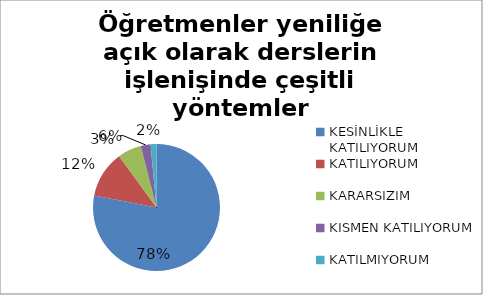
| Category | Öğretmenler yeniliğe açık olarak derslerin işlenişinde çeşitli yöntemler kullanmaktadır. |
|---|---|
| KESİNLİKLE KATILIYORUM | 156 |
| KATILIYORUM | 24 |
| KARARSIZIM | 12 |
| KISMEN KATILIYORUM | 5 |
| KATILMIYORUM | 3 |